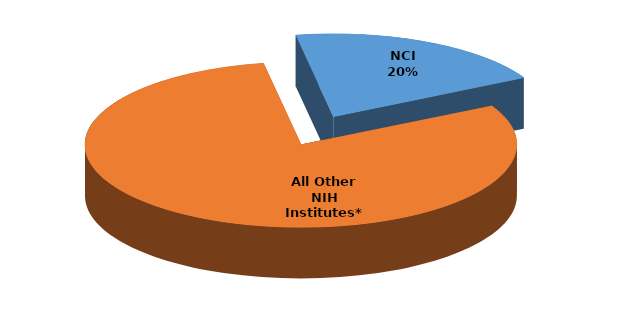
| Category | Series 0 |
|---|---|
| NCI | 453495464 |
| All Other NIH Institutes* | 1819830999 |